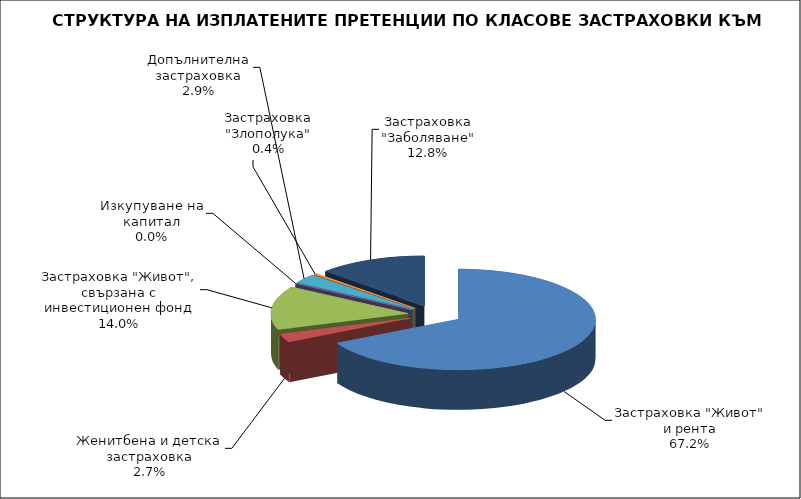
| Category | 12 182 550 |
|---|---|
| Застраховка "Живот" и рента | 12182549.574 |
| Женитбена и детска застраховка | 483510.598 |
| Застраховка "Живот", свързана с инвестиционен фонд | 2542227.073 |
| Изкупуване на капитал | 0 |
| Допълнителна застраховка | 534341.946 |
| Застраховка "Злополука" | 67930.978 |
| Застраховка "Заболяване" | 2329382.117 |